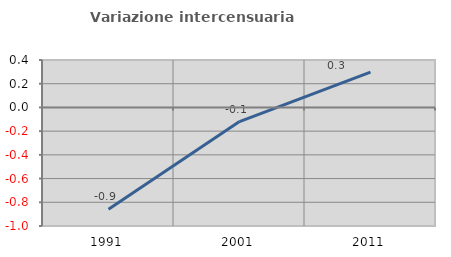
| Category | Variazione intercensuaria annua |
|---|---|
| 1991.0 | -0.858 |
| 2001.0 | -0.119 |
| 2011.0 | 0.298 |